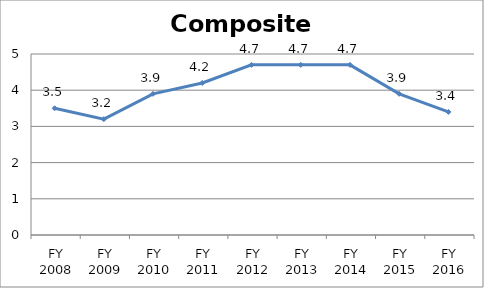
| Category | Composite score |
|---|---|
| FY 2016 | 3.4 |
| FY 2015 | 3.9 |
| FY 2014 | 4.7 |
| FY 2013 | 4.7 |
| FY 2012 | 4.7 |
| FY 2011 | 4.2 |
| FY 2010 | 3.9 |
| FY 2009 | 3.2 |
| FY 2008 | 3.5 |